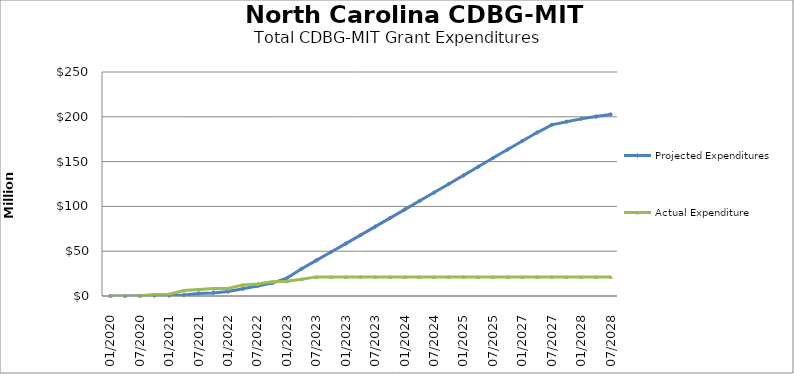
| Category | Projected Expenditures | Actual Expenditure |
|---|---|---|
| 01/2020 | 18934.446 | 0 |
| 04/2020 | 37847.561 | 0 |
| 07/2020 | 161413.244 | 274138.69 |
| 10/2020 | 353066.139 | 1630136.56 |
| 01/2021 | 574980.018 | 2069610.51 |
| 04/2021 | 993687.28 | 6125089.88 |
| 07/2021 | 2859148.887 | 7206271.93 |
| 10/2021 | 3482291.231 | 8249729 |
| 01/2022 | 5040955.542 | 8337416.56 |
| 04/2022 | 8046363.257 | 12423148.85 |
| 07/2022 | 11123640.807 | 13357397.11 |
| 10/2022 | 14360918.358 | 16041167.66 |
| 01/2023 | 19993881.494 | 16544013.24 |
| 04/2023 | 30357294.196 | 18803902.85 |
| 07/2023 | 39770706.898 | 21331656.97 |
| 10/2023 | 49134119.6 | 21331656.97 |
| 01/2023 | 58397532.302 | 21331656.97 |
| 04/2023 | 67910945.004 | 21331656.97 |
| 07/2023 | 77424357.706 | 21331656.97 |
| 10/2023 | 86937770.409 | 21331656.97 |
| 01/2024 | 96451183.111 | 21331656.97 |
| 04/2024 | 105964595.813 | 21331656.97 |
| 07/2024 | 115478008.515 | 21331656.97 |
| 10/2024 | 125041421.217 | 21331656.97 |
| 01/2025 | 134604833.919 | 21331656.97 |
| 04/2025 | 144268246.621 | 21331656.97 |
| 07/2025 | 153931659.323 | 21331656.97 |
| 10/2026 | 163495072.025 | 21331656.97 |
| 01/2027 | 173008484.727 | 21331656.97 |
| 04/2027 | 182421897.429 | 21331656.97 |
| 07/2027 | 191070154.995 | 21331656.97 |
| 10/2027 | 194486003.181 | 21331656.97 |
| 01/2028 | 197701851.367 | 21331656.97 |
| 04/2028 | 200251655.884 | 21331656.97 |
| 07/2028 | 202636014.736 | 21331656.97 |